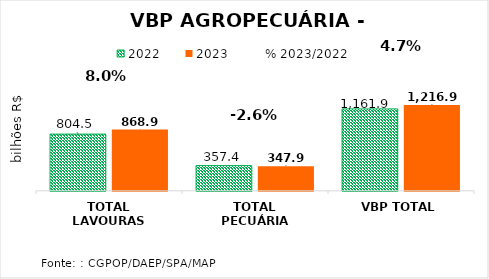
| Category | 2022 | 2023 |
|---|---|---|
| TOTAL LAVOURAS | 804.489 | 868.961 |
| TOTAL PECUÁRIA | 357.396 | 347.944 |
| VBP TOTAL | 1161.885 | 1216.906 |